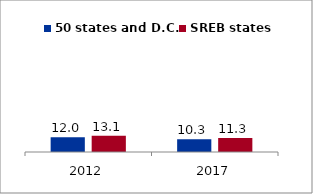
| Category | 50 states and D.C. | SREB states |
|---|---|---|
| 2012.0 | 11.971 | 13.074 |
| 2017.0 | 10.274 | 11.338 |